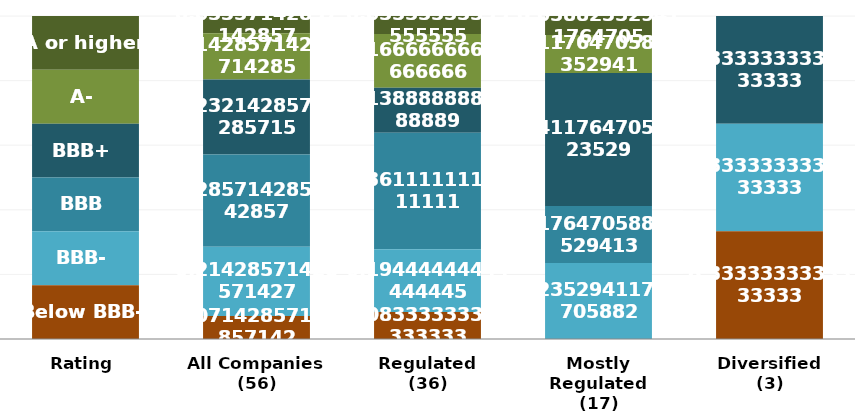
| Category | A or higher | A- | BBB+ | BBB | BBB- | Below BBB- |
|---|---|---|---|---|---|---|
| Rating | 1 | 1 | 1 | 1 | 1 | 1 |
| All Companies
(56) | 3 | 8 | 13 | 16 | 12 | 4 |
| Regulated
(36) | 2 | 6 | 5 | 13 | 7 | 3 |
| Mostly Regulated
(17) | 1 | 2 | 7 | 3 | 4 | 0 |
| Diversified
(3) | 0 | 0 | 1 | 0 | 1 | 1 |